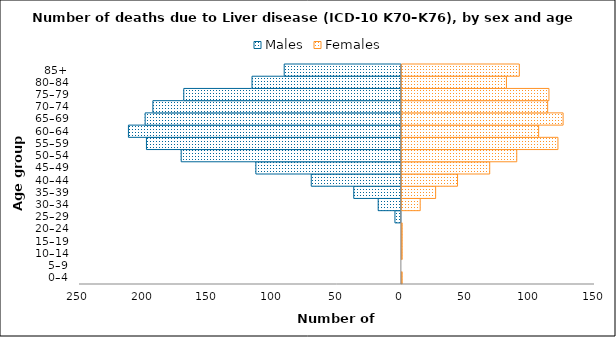
| Category | Males | Females |
|---|---|---|
| 0–4 | 0 | 1 |
| 5–9 | 0 | 0 |
| 10–14 | 0 | 1 |
| 15–19 | 0 | 1 |
| 20–24 | 0 | 1 |
| 25–29 | -5 | 0 |
| 30–34 | -18 | 15 |
| 35–39 | -37 | 27 |
| 40–44 | -70 | 44 |
| 45–49 | -113 | 69 |
| 50–54 | -171 | 90 |
| 55–59 | -198 | 122 |
| 60–64 | -212 | 107 |
| 65–69 | -199 | 126 |
| 70–74 | -193 | 114 |
| 75–79 | -169 | 115 |
| 80–84 | -116 | 82 |
| 85+ | -91 | 92 |